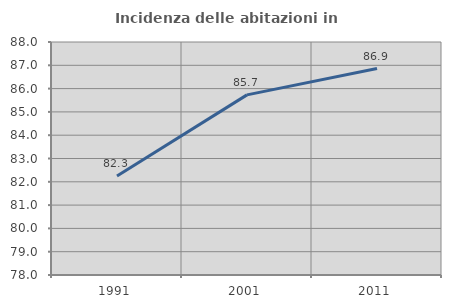
| Category | Incidenza delle abitazioni in proprietà  |
|---|---|
| 1991.0 | 82.252 |
| 2001.0 | 85.731 |
| 2011.0 | 86.859 |